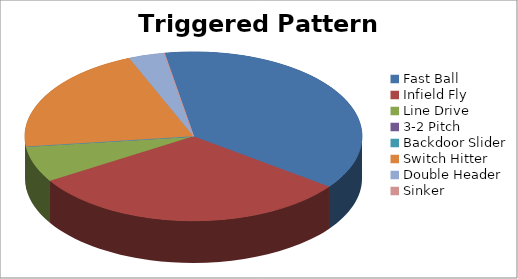
| Category | Triggered Pattern Distribution |
|---|---|
| Fast Ball | 22 |
| Infield Fly | 18 |
| Line Drive | 4 |
| 3-2 Pitch | 0 |
| Backdoor Slider | 0 |
| Switch Hitter | 12 |
| Double Header | 2 |
| Sinker | 0 |